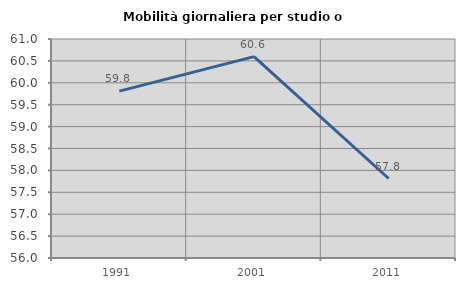
| Category | Mobilità giornaliera per studio o lavoro |
|---|---|
| 1991.0 | 59.811 |
| 2001.0 | 60.598 |
| 2011.0 | 57.815 |